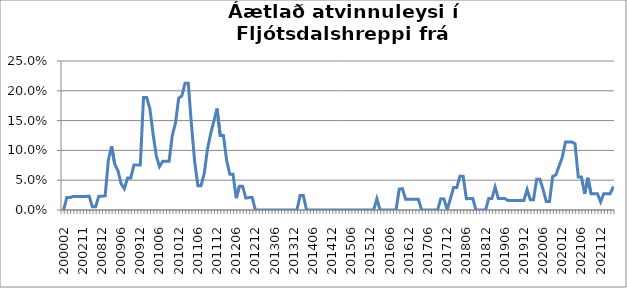
| Category | Series 0 |
|---|---|
| 200002 | 0 |
| 200102 | 0.021 |
| 200103 | 0.021 |
| 200111 | 0.023 |
| 200112 | 0.023 |
| 200201 | 0.023 |
| 200211 | 0.023 |
| 200212 | 0.023 |
| 200302 | 0.023 |
| 200409 | 0.005 |
| 200410 | 0.005 |
| 200811 | 0.023 |
| 200812 | 0.023 |
| 200901 | 0.024 |
| 200902 | 0.083 |
| 200903 | 0.107 |
| 200904 | 0.077 |
| 200905 | 0.066 |
| 200906 | 0.044 |
| 200907 | 0.036 |
| 200908 | 0.054 |
| 200909 | 0.054 |
| 200910 | 0.075 |
| 200911 | 0.075 |
| 200912 | 0.075 |
| 201001 | 0.189 |
| 201002 | 0.189 |
| 201003 | 0.17 |
| 201004 | 0.127 |
| 201005 | 0.091 |
| 201006 | 0.073 |
| 201007 | 0.082 |
| 201008 | 0.082 |
| 201009 | 0.082 |
| 201010 | 0.125 |
| 201011 | 0.146 |
| 201012 | 0.188 |
| 201101 | 0.191 |
| 201102 | 0.213 |
| 201103 | 0.213 |
| 201104 | 0.143 |
| 201105 | 0.082 |
| 201106 | 0.041 |
| 201107 | 0.041 |
| 201108 | 0.061 |
| 201109 | 0.102 |
| 201110 | 0.128 |
| 201111 | 0.149 |
| 201112 | 0.17 |
| 201201 | 0.125 |
| 201202 | 0.125 |
| 201203 | 0.083 |
| 201204 | 0.06 |
| 201205 | 0.06 |
| 201206 | 0.02 |
| 201207 | 0.04 |
| 201208 | 0.04 |
| 201209 | 0.02 |
| 201210 | 0.021 |
| 201211 | 0.021 |
| 201212 | 0 |
| 201301 | 0 |
| 201302 | 0 |
| 201303 | 0 |
| 201304 | 0 |
| 201305 | 0 |
| 201306 | 0 |
| 201307 | 0 |
| 201308 | 0 |
| 201309 | 0 |
| 201310 | 0 |
| 201311 | 0 |
| 201312 | 0 |
| 201401 | 0 |
| 201402 | 0.024 |
| 201403 | 0.024 |
| 201404 | 0 |
| 201405 | 0 |
| 201406 | 0 |
| 201407 | 0 |
| 201408 | 0 |
| 201409 | 0 |
| 201410 | 0 |
| 201411 | 0 |
| 201412 | 0 |
| 201501 | 0 |
| 201502 | 0 |
| 201503 | 0 |
| 201504 | 0 |
| 201505 | 0 |
| 201506 | 0 |
| 201507 | 0 |
| 201508 | 0 |
| 201509 | 0 |
| 201510 | 0 |
| 201511 | 0 |
| 201512 | 0 |
| 201601 | 0 |
| 201602 | 0.019 |
| 201603 | 0 |
| 201604 | 0 |
| 201605 | 0 |
| 201606 | 0 |
| 201607 | 0 |
| 201608 | 0 |
| 201609 | 0.035 |
| 201610 | 0.036 |
| 201611 | 0.018 |
| 201612 | 0.018 |
| 201701 | 0.018 |
| 201702 | 0.018 |
| 201703 | 0.018 |
| 201704 | 0 |
| 201705 | 0 |
| 201706 | 0 |
| 201707 | 0 |
| 201708 | 0 |
| 201709 | 0 |
| 201710 | 0.019 |
| 201711 | 0.019 |
| 201712 | 0 |
| 201801 | 0.019 |
| 201802 | 0.038 |
| 201803 | 0.038 |
| 201804 | 0.057 |
| 201805 | 0.057 |
| 201806 | 0.019 |
| 201807 | 0.019 |
| 201808 | 0.019 |
| 201809 | 0 |
| 201810 | 0 |
| 201811 | 0 |
| 201812 | 0 |
| 201901 | 0.019 |
| 201902 | 0.019 |
| 201903 | 0.038 |
| 201904 | 0.019 |
| 201905 | 0.019 |
| 201906 | 0.019 |
| 201907 | 0.016 |
| 201908 | 0.016 |
| 201909 | 0.016 |
| 201910 | 0.016 |
| 201911 | 0.016 |
| 201912 | 0.016 |
| 202001 | 0.034 |
| 202002 | 0.017 |
| 202003*** | 0.017 |
| 202004 | 0.052 |
| 202005 | 0.052 |
| 202006 | 0.034 |
| 202007 | 0.014 |
| 202008 | 0.014 |
| 202009 | 0.056 |
| 202010 | 0.059 |
| 202011 | 0.074 |
| 202012 | 0.088 |
| 202101 | 0.114 |
| 202102 | 0.114 |
| 202103 | 0.114 |
| 202104 | 0.111 |
| 202105 | 0.056 |
| 202106 | 0.056 |
| 202107 | 0.027 |
| 202108 | 0.054 |
| 202109 | 0.027 |
| 202110 | 0.027 |
| 202111 | 0.027 |
| 202112 | 0.014 |
| 202201 | 0.027 |
| 202202 | 0.027 |
| 202203 | 0.027 |
| 202204 | 0.039 |